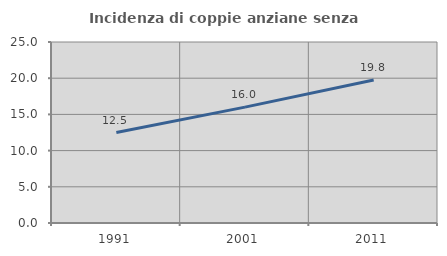
| Category | Incidenza di coppie anziane senza figli  |
|---|---|
| 1991.0 | 12.499 |
| 2001.0 | 16.004 |
| 2011.0 | 19.75 |